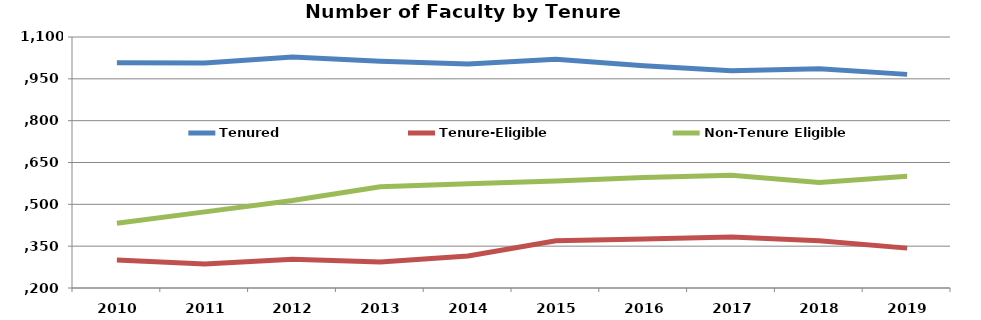
| Category | Tenured | Tenure-Eligible | Non-Tenure Eligible |
|---|---|---|---|
| 2010.0 | 1008 | 300 | 432 |
| 2011.0 | 1007 | 286 | 473 |
| 2012.0 | 1028 | 303 | 514 |
| 2013.0 | 1013 | 293 | 563 |
| 2014.0 | 1003 | 315 | 574 |
| 2015.0 | 1020 | 369 | 584 |
| 2016.0 | 997 | 376 | 596 |
| 2017.0 | 979 | 383 | 604 |
| 2018.0 | 986 | 369 | 578 |
| 2019.0 | 966 | 343 | 601 |